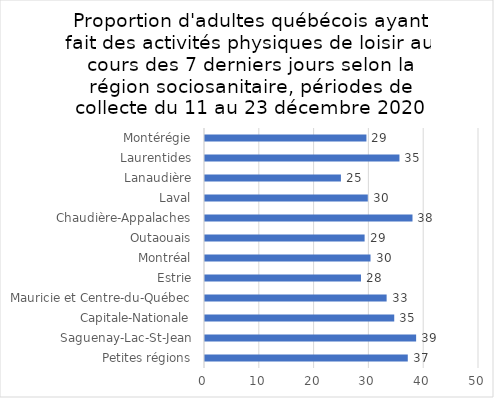
| Category | Oui |
|---|---|
| Petites régions | 37.004 |
| Saguenay-Lac-St-Jean | 38.527 |
| Capitale-Nationale | 34.532 |
| Mauricie et Centre-du-Québec | 33.144 |
| Estrie | 28.463 |
| Montréal | 30.203 |
| Outaouais | 29.126 |
| Chaudière-Appalaches | 37.865 |
| Laval | 29.708 |
| Lanaudière | 24.801 |
| Laurentides | 35.485 |
| Montérégie | 29.458 |